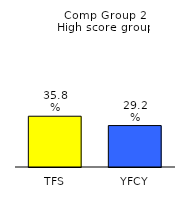
| Category | Series 0 |
|---|---|
| TFS | 0.358 |
| YFCY | 0.292 |